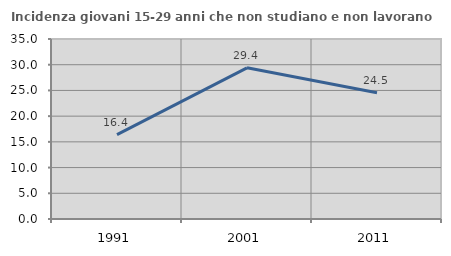
| Category | Incidenza giovani 15-29 anni che non studiano e non lavorano  |
|---|---|
| 1991.0 | 16.415 |
| 2001.0 | 29.392 |
| 2011.0 | 24.541 |